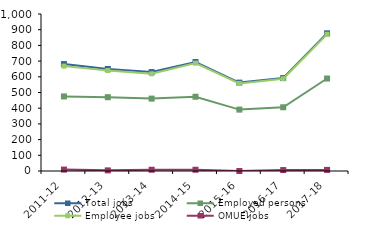
| Category | Total jobs | Employed persons | Employee jobs | OMUE jobs |
|---|---|---|---|---|
| 2011-12 | 681 | 475 | 668 | 9 |
| 2012-13 | 650 | 470 | 640 | 4 |
| 2013-14 | 630 | 461 | 619 | 8 |
| 2014-15 | 694 | 473 | 687 | 8 |
| 2015-16 | 563 | 391 | 558 | 0 |
| 2016-17 | 592 | 406 | 588 | 6 |
| 2017-18 | 877 | 589 | 871 | 7 |